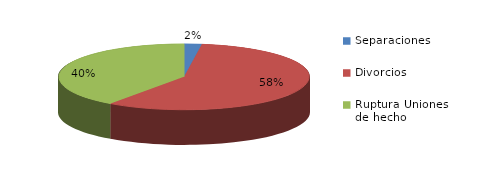
| Category | Series 0 |
|---|---|
| Separaciones | 12 |
| Divorcios | 306 |
| Ruptura Uniones de hecho | 213 |